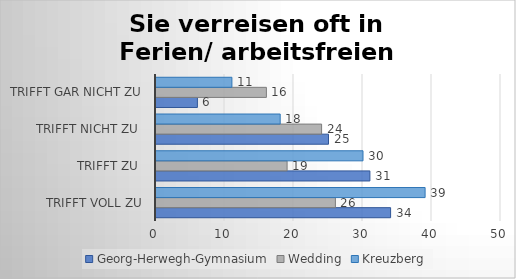
| Category | Georg-Herwegh-Gymnasium | Wedding | Kreuzberg |
|---|---|---|---|
| trifft voll zu | 34 | 26 | 39 |
| trifft zu  | 31 | 19 | 30 |
| trifft nicht zu  | 25 | 24 | 18 |
| trifft gar nicht zu | 6 | 16 | 11 |